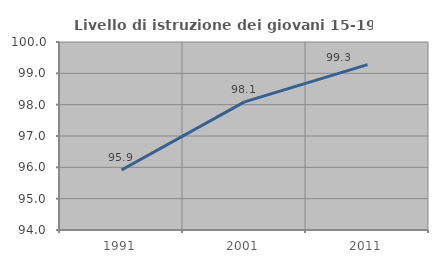
| Category | Livello di istruzione dei giovani 15-19 anni |
|---|---|
| 1991.0 | 95.913 |
| 2001.0 | 98.089 |
| 2011.0 | 99.278 |